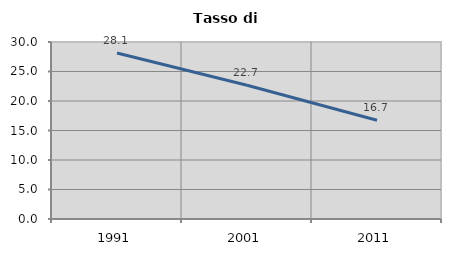
| Category | Tasso di disoccupazione   |
|---|---|
| 1991.0 | 28.141 |
| 2001.0 | 22.662 |
| 2011.0 | 16.736 |